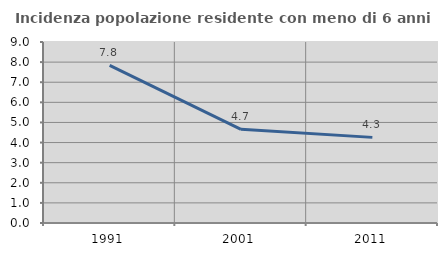
| Category | Incidenza popolazione residente con meno di 6 anni |
|---|---|
| 1991.0 | 7.84 |
| 2001.0 | 4.659 |
| 2011.0 | 4.258 |